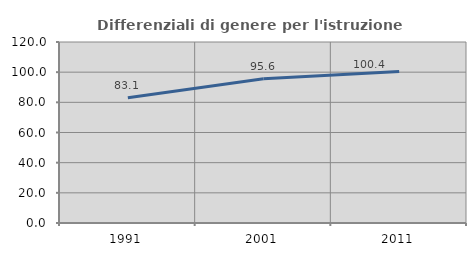
| Category | Differenziali di genere per l'istruzione superiore |
|---|---|
| 1991.0 | 83.101 |
| 2001.0 | 95.611 |
| 2011.0 | 100.4 |